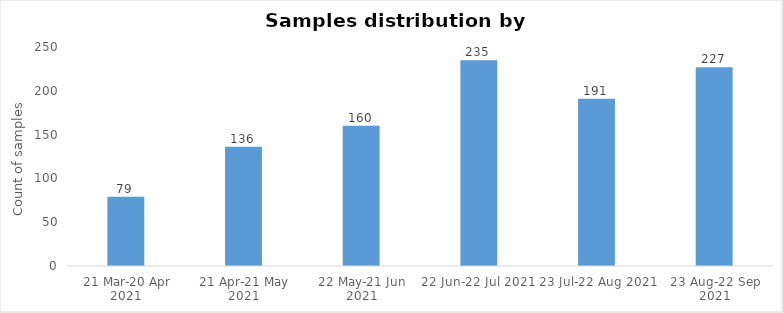
| Category | Sample count |
|---|---|
| 21 Mar-20 Apr 2021 | 79 |
| 21 Apr-21 May 2021 | 136 |
| 22 May-21 Jun 2021 | 160 |
| 22 Jun-22 Jul 2021 | 235 |
| 23 Jul-22 Aug 2021 | 191 |
| 23 Aug-22 Sep 2021 | 227 |